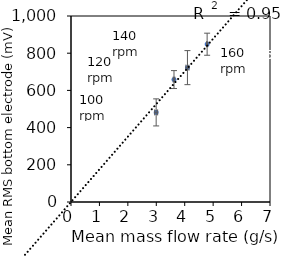
| Category | Series 0 |
|---|---|
| 2.9957333333333334 | 481.749 |
| 3.6231000000000004 | 658.222 |
| 4.095933333333334 | 722.415 |
| 4.788766666666667 | 848.275 |